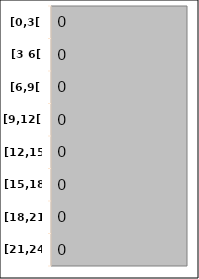
| Category | Series 0 |
|---|---|
| [0,3[ | 0 |
| [3 6[ | 0 |
| [6,9[ | 0 |
| [9,12[ | 0 |
| [12,15[ | 0 |
| [15,18[ | 0 |
| [18,21[ | 0 |
| [21,24] | 0 |